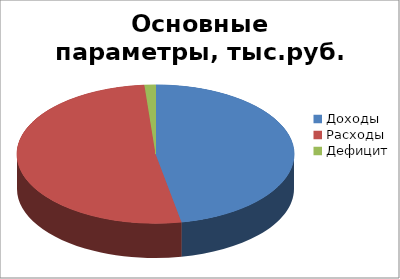
| Category | Итог |
|---|---|
| Доходы | 2203839.9 |
| Расходы | 2424382.9 |
| Дефицит | 60000 |